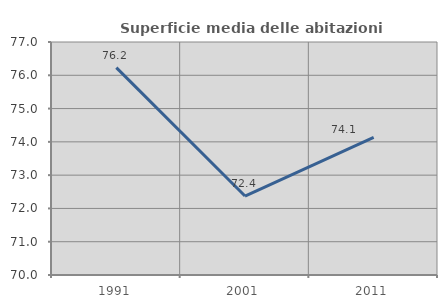
| Category | Superficie media delle abitazioni occupate |
|---|---|
| 1991.0 | 76.231 |
| 2001.0 | 72.373 |
| 2011.0 | 74.134 |